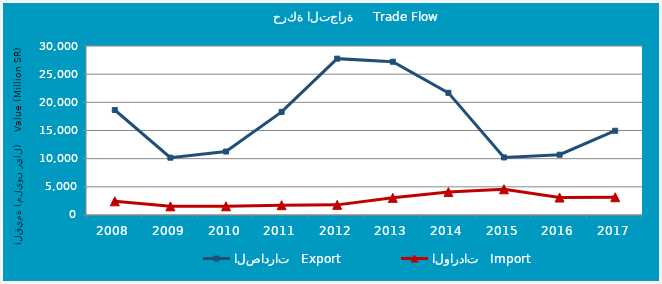
| Category | الصادرات   Export | الواردات   Import |
|---|---|---|
| 2008.0 | 18637831559 | 2430139963 |
| 2009.0 | 10174727777 | 1533590856 |
| 2010.0 | 11266896440 | 1543486011 |
| 2011.0 | 18301574832 | 1738136112 |
| 2012.0 | 27754927342 | 1797587604 |
| 2013.0 | 27208165833 | 3042459596 |
| 2014.0 | 21689323916 | 4064367030 |
| 2015.0 | 10220368610 | 4572152106 |
| 2016.0 | 10701425974 | 3103426801 |
| 2017.0 | 14957714084 | 3151877367 |